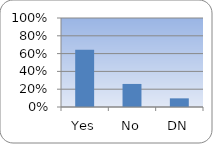
| Category | Series 0 |
|---|---|
| Yes | 0.644 |
| No | 0.259 |
| DN | 0.097 |